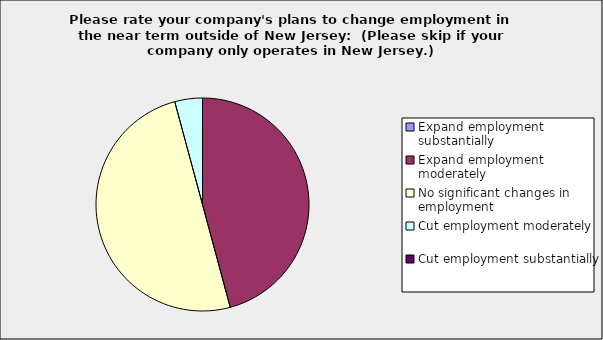
| Category | Series 0 |
|---|---|
| Expand employment substantially | 0 |
| Expand employment moderately | 0.458 |
| No significant changes in employment | 0.5 |
| Cut employment moderately | 0.042 |
| Cut employment substantially | 0 |